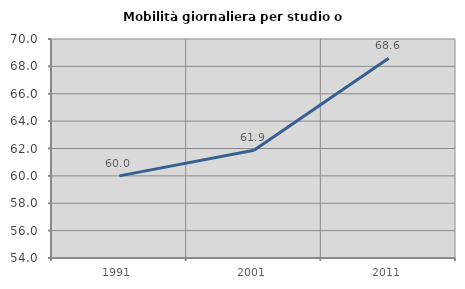
| Category | Mobilità giornaliera per studio o lavoro |
|---|---|
| 1991.0 | 60 |
| 2001.0 | 61.872 |
| 2011.0 | 68.59 |